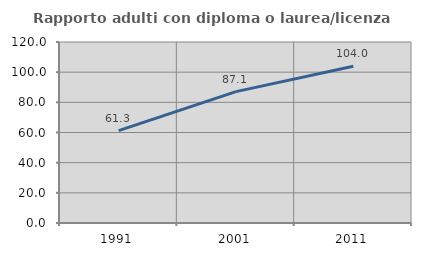
| Category | Rapporto adulti con diploma o laurea/licenza media  |
|---|---|
| 1991.0 | 61.25 |
| 2001.0 | 87.101 |
| 2011.0 | 103.974 |